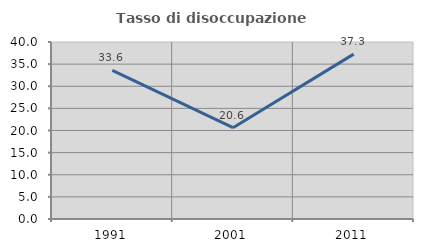
| Category | Tasso di disoccupazione giovanile  |
|---|---|
| 1991.0 | 33.607 |
| 2001.0 | 20.635 |
| 2011.0 | 37.255 |